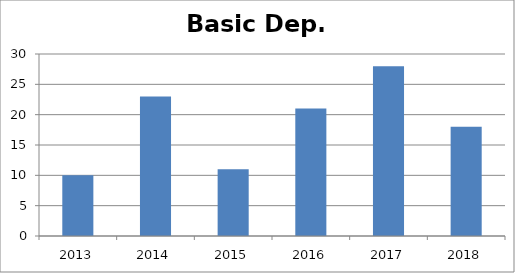
| Category | Basic Dep. Publications |
|---|---|
| 0 | 10 |
| 1 | 23 |
| 2 | 11 |
| 3 | 21 |
| 4 | 28 |
| 5 | 18 |